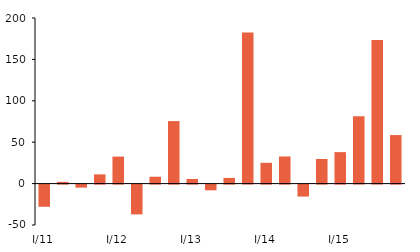
| Category | Series 1 |
|---|---|
| I/11 | -26.789 |
| II | 2.123 |
| III | -3.698 |
| IV | 11.134 |
| I/12 | 32.632 |
| II | -35.982 |
| III | 8.321 |
| IV | 75.502 |
| I/13 | 5.61 |
| II | -6.912 |
| III | 6.889 |
| IV | 182.604 |
| I/14 | 25.08 |
| II | 32.776 |
| III | -14.448 |
| IV | 29.714 |
| I/15 | 38.01 |
| II | 81.243 |
| III | 173.44 |
| IV | 58.612 |